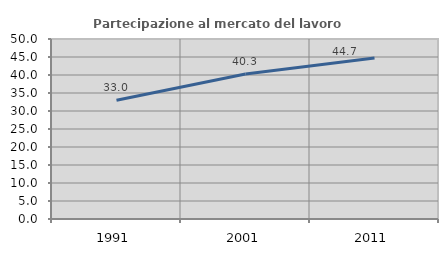
| Category | Partecipazione al mercato del lavoro  femminile |
|---|---|
| 1991.0 | 33.011 |
| 2001.0 | 40.255 |
| 2011.0 | 44.697 |